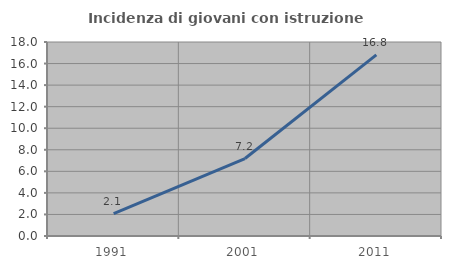
| Category | Incidenza di giovani con istruzione universitaria |
|---|---|
| 1991.0 | 2.079 |
| 2001.0 | 7.187 |
| 2011.0 | 16.81 |